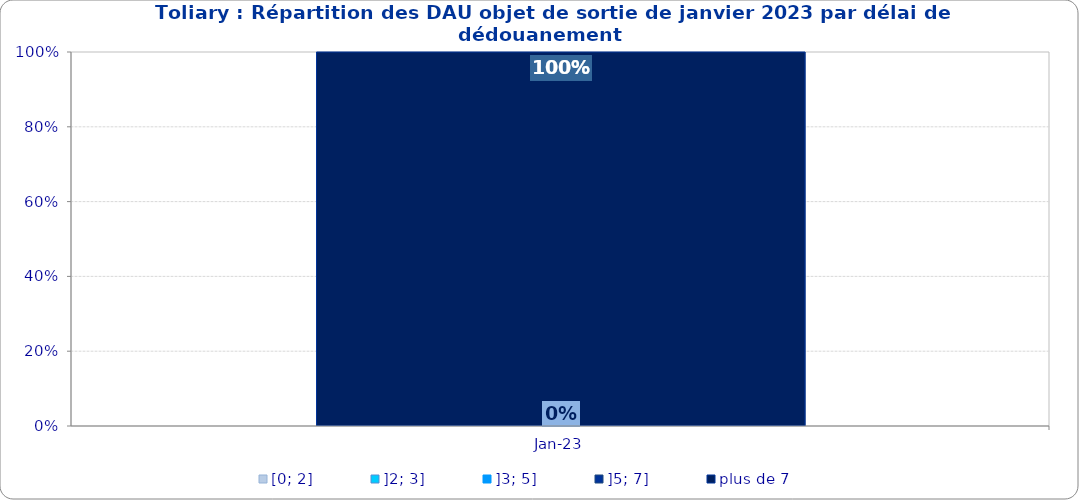
| Category | [0; 2] | ]2; 3] | ]3; 5] | ]5; 7] | plus de 7 |
|---|---|---|---|---|---|
| 2023-01-01 | 0 | 0 | 0 | 0 | 1 |